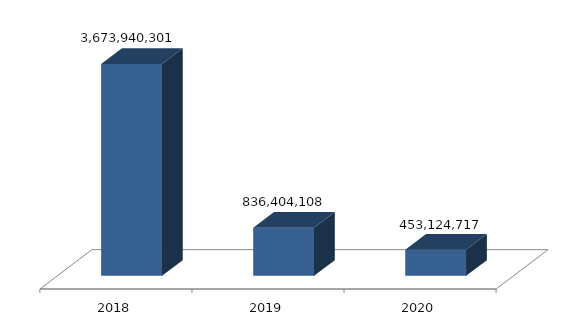
| Category | Series 0 |
|---|---|
| 0 | 3673940301 |
| 1 | 836404108 |
| 2 | 453124717 |